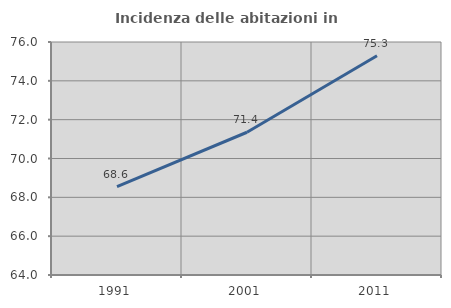
| Category | Incidenza delle abitazioni in proprietà  |
|---|---|
| 1991.0 | 68.557 |
| 2001.0 | 71.352 |
| 2011.0 | 75.29 |